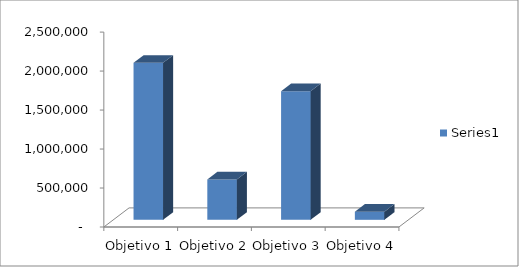
| Category | Series 0 |
|---|---|
| Objetivo 1 | 2014096.184 |
| Objetivo 2 | 518206.68 |
| Objetivo 3 | 1650583 |
| Objetivo 4 | 103829 |